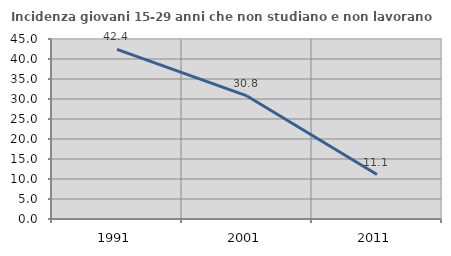
| Category | Incidenza giovani 15-29 anni che non studiano e non lavorano  |
|---|---|
| 1991.0 | 42.403 |
| 2001.0 | 30.769 |
| 2011.0 | 11.111 |